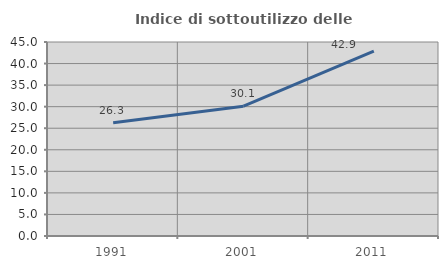
| Category | Indice di sottoutilizzo delle abitazioni  |
|---|---|
| 1991.0 | 26.276 |
| 2001.0 | 30.099 |
| 2011.0 | 42.857 |